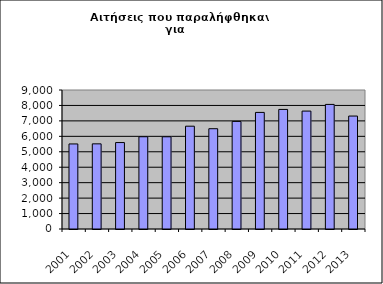
| Category | Series 1 |
|---|---|
| 2001.0 | 5507 |
| 2002.0 | 5513 |
| 2003.0 | 5597 |
| 2004.0 | 5974 |
| 2005.0 | 5970 |
| 2006.0 | 6656 |
| 2007.0 | 6494 |
| 2008.0 | 6966 |
| 2009.0 | 7549 |
| 2010.0 | 7742 |
| 2011.0 | 7635 |
| 2012.0 | 8067 |
| 2013.0 | 7313 |